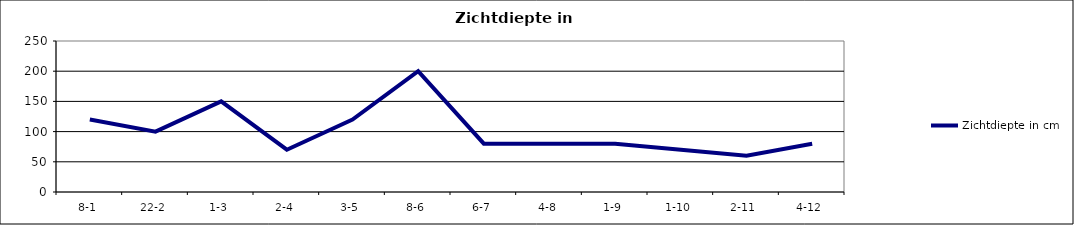
| Category | Zichtdiepte in cm |
|---|---|
| 8-1 | 120 |
| 22-2 | 100 |
| 1-3 | 150 |
| 2-4 | 70 |
| 3-5 | 120 |
| 8-6 | 200 |
| 6-7 | 80 |
| 4-8 | 80 |
| 1-9 | 80 |
| 1-10 | 70 |
| 2-11 | 60 |
| 4-12 | 80 |